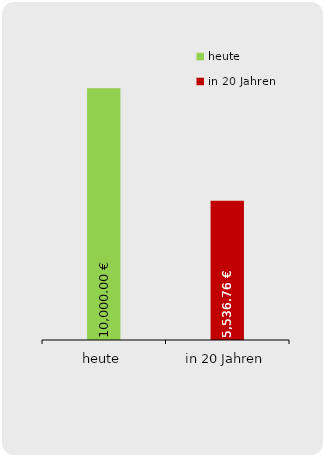
| Category | Inflation 3% |
|---|---|
| heute | 10000 |
| in 20 Jahren | 5536.758 |